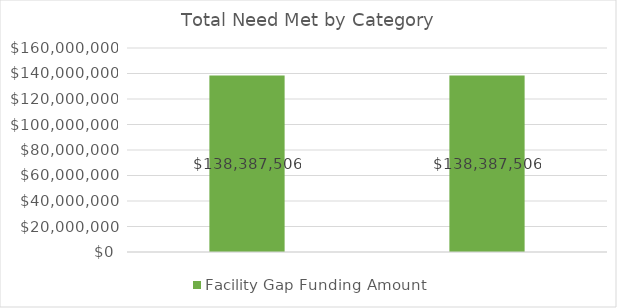
| Category | Facility Gap Funding Amount |
|---|---|
|  | 138387505.528 |
|  | 138387505.528 |